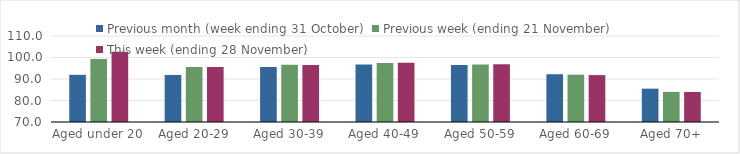
| Category | Previous month (week ending 31 October) | Previous week (ending 21 November) | This week (ending 28 November) |
|---|---|---|---|
| Aged under 20 | 91.95 | 99.34 | 102.66 |
| Aged 20-29 | 91.88 | 95.59 | 95.59 |
| Aged 30-39 | 95.56 | 96.62 | 96.54 |
| Aged 40-49 | 96.78 | 97.49 | 97.6 |
| Aged 50-59 | 96.5 | 96.8 | 96.91 |
| Aged 60-69 | 92.21 | 92.01 | 91.82 |
| Aged 70+ | 85.51 | 84.02 | 83.99 |